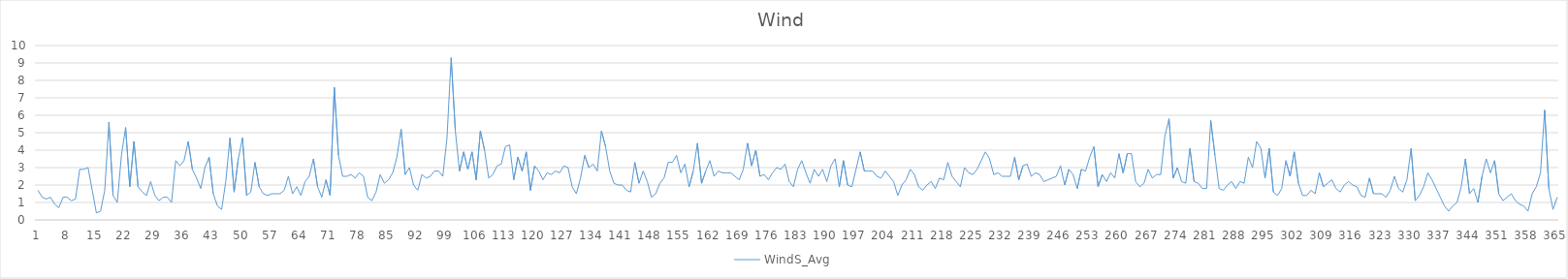
| Category | WindS_Avg |
|---|---|
| 0 | 1.7 |
| 1 | 1.3 |
| 2 | 1.2 |
| 3 | 1.3 |
| 4 | 0.9 |
| 5 | 0.7 |
| 6 | 1.3 |
| 7 | 1.3 |
| 8 | 1.1 |
| 9 | 1.2 |
| 10 | 2.9 |
| 11 | 2.9 |
| 12 | 3 |
| 13 | 1.7 |
| 14 | 0.4 |
| 15 | 0.5 |
| 16 | 1.7 |
| 17 | 5.6 |
| 18 | 1.4 |
| 19 | 1 |
| 20 | 3.7 |
| 21 | 5.3 |
| 22 | 1.9 |
| 23 | 4.5 |
| 24 | 1.9 |
| 25 | 1.6 |
| 26 | 1.4 |
| 27 | 2.2 |
| 28 | 1.4 |
| 29 | 1.1 |
| 30 | 1.3 |
| 31 | 1.3 |
| 32 | 1 |
| 33 | 3.4 |
| 34 | 3.1 |
| 35 | 3.4 |
| 36 | 4.5 |
| 37 | 2.9 |
| 38 | 2.4 |
| 39 | 1.8 |
| 40 | 3 |
| 41 | 3.6 |
| 42 | 1.5 |
| 43 | 0.8 |
| 44 | 0.6 |
| 45 | 2.2 |
| 46 | 4.7 |
| 47 | 1.6 |
| 48 | 3.5 |
| 49 | 4.7 |
| 50 | 1.4 |
| 51 | 1.6 |
| 52 | 3.3 |
| 53 | 1.9 |
| 54 | 1.5 |
| 55 | 1.4 |
| 56 | 1.5 |
| 57 | 1.5 |
| 58 | 1.5 |
| 59 | 1.7 |
| 60 | 2.5 |
| 61 | 1.5 |
| 62 | 1.9 |
| 63 | 1.4 |
| 64 | 2.2 |
| 65 | 2.5 |
| 66 | 3.5 |
| 67 | 1.9 |
| 68 | 1.3 |
| 69 | 2.3 |
| 70 | 1.4 |
| 71 | 7.6 |
| 72 | 3.7 |
| 73 | 2.5 |
| 74 | 2.5 |
| 75 | 2.6 |
| 76 | 2.4 |
| 77 | 2.7 |
| 78 | 2.5 |
| 79 | 1.3 |
| 80 | 1.1 |
| 81 | 1.6 |
| 82 | 2.6 |
| 83 | 2.1 |
| 84 | 2.3 |
| 85 | 2.7 |
| 86 | 3.6 |
| 87 | 5.2 |
| 88 | 2.6 |
| 89 | 3 |
| 90 | 2 |
| 91 | 1.7 |
| 92 | 2.6 |
| 93 | 2.4 |
| 94 | 2.5 |
| 95 | 2.8 |
| 96 | 2.8 |
| 97 | 2.5 |
| 98 | 4.7 |
| 99 | 9.3 |
| 100 | 5.1 |
| 101 | 2.8 |
| 102 | 3.9 |
| 103 | 2.9 |
| 104 | 3.9 |
| 105 | 2.3 |
| 106 | 5.1 |
| 107 | 4 |
| 108 | 2.4 |
| 109 | 2.6 |
| 110 | 3.1 |
| 111 | 3.2 |
| 112 | 4.2 |
| 113 | 4.3 |
| 114 | 2.3 |
| 115 | 3.6 |
| 116 | 2.8 |
| 117 | 3.9 |
| 118 | 1.7 |
| 119 | 3.1 |
| 120 | 2.8 |
| 121 | 2.3 |
| 122 | 2.7 |
| 123 | 2.6 |
| 124 | 2.8 |
| 125 | 2.7 |
| 126 | 3.1 |
| 127 | 3 |
| 128 | 1.9 |
| 129 | 1.5 |
| 130 | 2.4 |
| 131 | 3.7 |
| 132 | 3 |
| 133 | 3.2 |
| 134 | 2.8 |
| 135 | 5.1 |
| 136 | 4.2 |
| 137 | 2.8 |
| 138 | 2.1 |
| 139 | 2 |
| 140 | 2 |
| 141 | 1.7 |
| 142 | 1.6 |
| 143 | 3.3 |
| 144 | 2.1 |
| 145 | 2.8 |
| 146 | 2.2 |
| 147 | 1.3 |
| 148 | 1.5 |
| 149 | 2.1 |
| 150 | 2.4 |
| 151 | 3.3 |
| 152 | 3.3 |
| 153 | 3.7 |
| 154 | 2.7 |
| 155 | 3.2 |
| 156 | 1.9 |
| 157 | 2.8 |
| 158 | 4.4 |
| 159 | 2.1 |
| 160 | 2.8 |
| 161 | 3.4 |
| 162 | 2.5 |
| 163 | 2.8 |
| 164 | 2.7 |
| 165 | 2.7 |
| 166 | 2.7 |
| 167 | 2.5 |
| 168 | 2.3 |
| 169 | 2.9 |
| 170 | 4.4 |
| 171 | 3.1 |
| 172 | 4 |
| 173 | 2.5 |
| 174 | 2.6 |
| 175 | 2.3 |
| 176 | 2.7 |
| 177 | 3 |
| 178 | 2.9 |
| 179 | 3.2 |
| 180 | 2.2 |
| 181 | 1.9 |
| 182 | 2.9 |
| 183 | 3.4 |
| 184 | 2.7 |
| 185 | 2.1 |
| 186 | 2.9 |
| 187 | 2.5 |
| 188 | 2.9 |
| 189 | 2.2 |
| 190 | 3.1 |
| 191 | 3.5 |
| 192 | 1.9 |
| 193 | 3.4 |
| 194 | 2 |
| 195 | 1.9 |
| 196 | 2.9 |
| 197 | 3.9 |
| 198 | 2.8 |
| 199 | 2.8 |
| 200 | 2.8 |
| 201 | 2.5 |
| 202 | 2.4 |
| 203 | 2.8 |
| 204 | 2.5 |
| 205 | 2.2 |
| 206 | 1.4 |
| 207 | 2 |
| 208 | 2.3 |
| 209 | 2.9 |
| 210 | 2.6 |
| 211 | 1.9 |
| 212 | 1.7 |
| 213 | 2 |
| 214 | 2.2 |
| 215 | 1.8 |
| 216 | 2.4 |
| 217 | 2.3 |
| 218 | 3.3 |
| 219 | 2.5 |
| 220 | 2.2 |
| 221 | 1.9 |
| 222 | 3 |
| 223 | 2.7 |
| 224 | 2.6 |
| 225 | 2.9 |
| 226 | 3.4 |
| 227 | 3.9 |
| 228 | 3.5 |
| 229 | 2.6 |
| 230 | 2.7 |
| 231 | 2.5 |
| 232 | 2.5 |
| 233 | 2.5 |
| 234 | 3.6 |
| 235 | 2.3 |
| 236 | 3.1 |
| 237 | 3.2 |
| 238 | 2.5 |
| 239 | 2.7 |
| 240 | 2.6 |
| 241 | 2.2 |
| 242 | 2.3 |
| 243 | 2.4 |
| 244 | 2.5 |
| 245 | 3.1 |
| 246 | 2 |
| 247 | 2.9 |
| 248 | 2.6 |
| 249 | 1.8 |
| 250 | 2.9 |
| 251 | 2.8 |
| 252 | 3.6 |
| 253 | 4.2 |
| 254 | 1.9 |
| 255 | 2.6 |
| 256 | 2.2 |
| 257 | 2.7 |
| 258 | 2.4 |
| 259 | 3.8 |
| 260 | 2.7 |
| 261 | 3.8 |
| 262 | 3.8 |
| 263 | 2.2 |
| 264 | 1.9 |
| 265 | 2.1 |
| 266 | 2.9 |
| 267 | 2.4 |
| 268 | 2.6 |
| 269 | 2.6 |
| 270 | 4.8 |
| 271 | 5.8 |
| 272 | 2.4 |
| 273 | 3 |
| 274 | 2.2 |
| 275 | 2.1 |
| 276 | 4.1 |
| 277 | 2.2 |
| 278 | 2.1 |
| 279 | 1.8 |
| 280 | 1.8 |
| 281 | 5.7 |
| 282 | 3.7 |
| 283 | 1.8 |
| 284 | 1.7 |
| 285 | 2 |
| 286 | 2.2 |
| 287 | 1.8 |
| 288 | 2.2 |
| 289 | 2.1 |
| 290 | 3.6 |
| 291 | 3 |
| 292 | 4.5 |
| 293 | 4.1 |
| 294 | 2.4 |
| 295 | 4.1 |
| 296 | 1.6 |
| 297 | 1.4 |
| 298 | 1.8 |
| 299 | 3.4 |
| 300 | 2.5 |
| 301 | 3.9 |
| 302 | 2.1 |
| 303 | 1.4 |
| 304 | 1.4 |
| 305 | 1.7 |
| 306 | 1.5 |
| 307 | 2.7 |
| 308 | 1.9 |
| 309 | 2.1 |
| 310 | 2.3 |
| 311 | 1.8 |
| 312 | 1.6 |
| 313 | 2 |
| 314 | 2.2 |
| 315 | 2 |
| 316 | 1.9 |
| 317 | 1.4 |
| 318 | 1.3 |
| 319 | 2.4 |
| 320 | 1.5 |
| 321 | 1.5 |
| 322 | 1.5 |
| 323 | 1.3 |
| 324 | 1.7 |
| 325 | 2.5 |
| 326 | 1.8 |
| 327 | 1.6 |
| 328 | 2.3 |
| 329 | 4.1 |
| 330 | 1.1 |
| 331 | 1.4 |
| 332 | 1.9 |
| 333 | 2.7 |
| 334 | 2.3 |
| 335 | 1.8 |
| 336 | 1.3 |
| 337 | 0.8 |
| 338 | 0.5 |
| 339 | 0.8 |
| 340 | 1 |
| 341 | 1.9 |
| 342 | 3.5 |
| 343 | 1.5 |
| 344 | 1.8 |
| 345 | 1 |
| 346 | 2.5 |
| 347 | 3.5 |
| 348 | 2.7 |
| 349 | 3.4 |
| 350 | 1.5 |
| 351 | 1.1 |
| 352 | 1.3 |
| 353 | 1.5 |
| 354 | 1.1 |
| 355 | 0.9 |
| 356 | 0.8 |
| 357 | 0.5 |
| 358 | 1.5 |
| 359 | 1.9 |
| 360 | 2.7 |
| 361 | 6.3 |
| 362 | 1.8 |
| 363 | 0.6 |
| 364 | 1.3 |